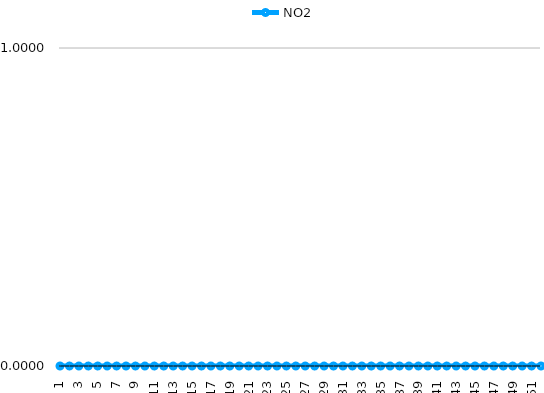
| Category | NO2 |
|---|---|
| 1 | 0 |
| 2 | 0 |
| 3 | 0 |
| 4 | 0 |
| 5 | 0 |
| 6 | 0 |
| 7 | 0 |
| 8 | 0 |
| 9 | 0 |
| 10 | 0 |
| 11 | 0 |
| 12 | 0 |
| 13 | 0 |
| 14 | 0 |
| 15 | 0 |
| 16 | 0 |
| 17 | 0 |
| 18 | 0 |
| 19 | 0 |
| 20 | 0 |
| 21 | 0 |
| 22 | 0 |
| 23 | 0 |
| 24 | 0 |
| 25 | 0 |
| 26 | 0 |
| 27 | 0 |
| 28 | 0 |
| 29 | 0 |
| 30 | 0 |
| 31 | 0 |
| 32 | 0 |
| 33 | 0 |
| 34 | 0 |
| 35 | 0 |
| 36 | 0 |
| 37 | 0 |
| 38 | 0 |
| 39 | 0 |
| 40 | 0 |
| 41 | 0 |
| 42 | 0 |
| 43 | 0 |
| 44 | 0 |
| 45 | 0 |
| 46 | 0 |
| 47 | 0 |
| 48 | 0 |
| 49 | 0 |
| 50 | 0 |
| 51 | 0 |
| 52 | 0 |